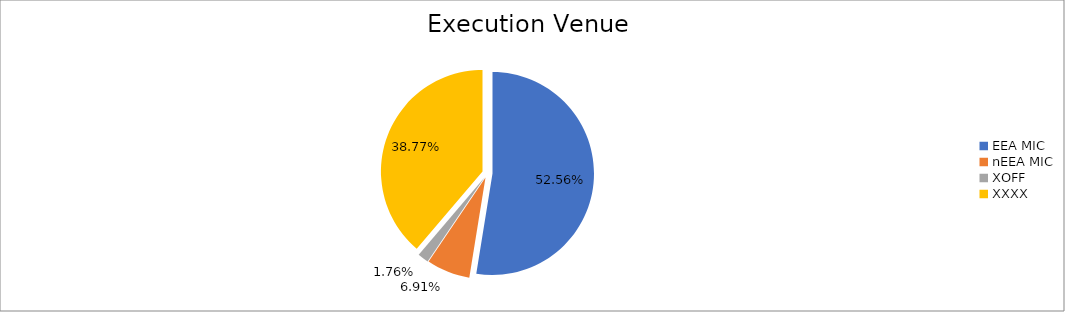
| Category | Series 0 |
|---|---|
| EEA MIC | 6669910.775 |
| nEEA MIC | 876836.065 |
| XOFF | 223574.995 |
| XXXX | 4920848.312 |